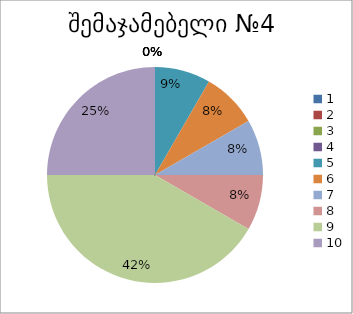
| Category | რაოდენობა | ქულა |
|---|---|---|
| 0 | 0 | 1 |
| 1 | 0 | 2 |
| 2 | 0 | 3 |
| 3 | 0 | 4 |
| 4 | 1 | 5 |
| 5 | 1 | 6 |
| 6 | 1 | 7 |
| 7 | 1 | 8 |
| 8 | 5 | 9 |
| 9 | 3 | 10 |